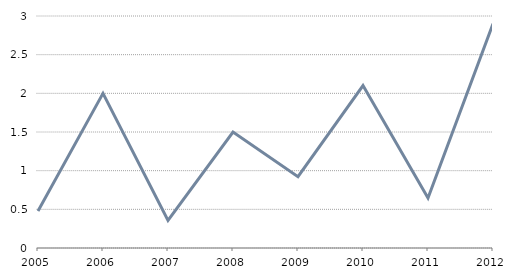
| Category | Series 0 |
|---|---|
| 2005.0 | 0.479 |
| 2006.0 | 2 |
| 2007.0 | 0.357 |
| 2008.0 | 1.5 |
| 2009.0 | 0.923 |
| 2010.0 | 2.1 |
| 2011.0 | 0.647 |
| 2012.0 | 2.9 |